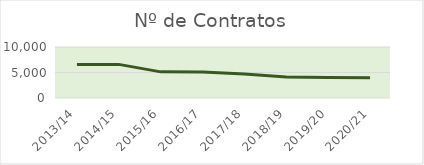
| Category | Contratos |
|---|---|
| 2013/14 | 6551 |
| 2014/15 | 6592 |
| 2015/16 | 5125 |
| 2016/17 | 5100 |
| 2017/18 | 4687 |
| 2018/19 | 4123 |
| 2019/20 | 4022 |
| 2020/21 | 3994 |